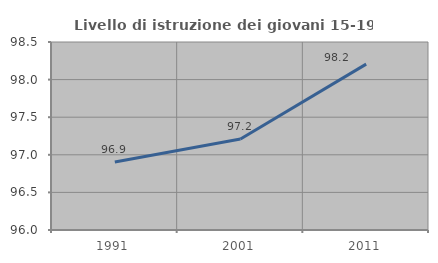
| Category | Livello di istruzione dei giovani 15-19 anni |
|---|---|
| 1991.0 | 96.904 |
| 2001.0 | 97.209 |
| 2011.0 | 98.206 |